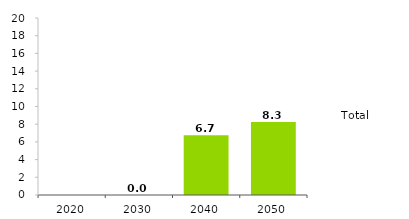
| Category | Anaerobic Digestion | Total |
|---|---|---|
| 2020.0 | 0 | 0 |
| 2030.0 | 0 | 0 |
| 2040.0 | 6.74 | 6.74 |
| 2050.0 | 8.26 | 8.26 |